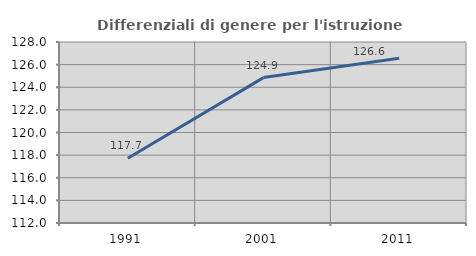
| Category | Differenziali di genere per l'istruzione superiore |
|---|---|
| 1991.0 | 117.729 |
| 2001.0 | 124.853 |
| 2011.0 | 126.561 |